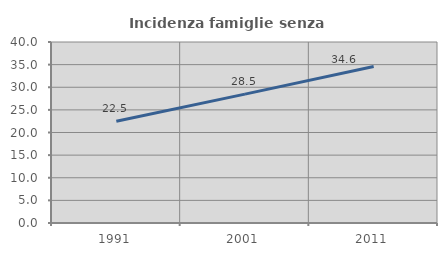
| Category | Incidenza famiglie senza nuclei |
|---|---|
| 1991.0 | 22.482 |
| 2001.0 | 28.487 |
| 2011.0 | 34.59 |